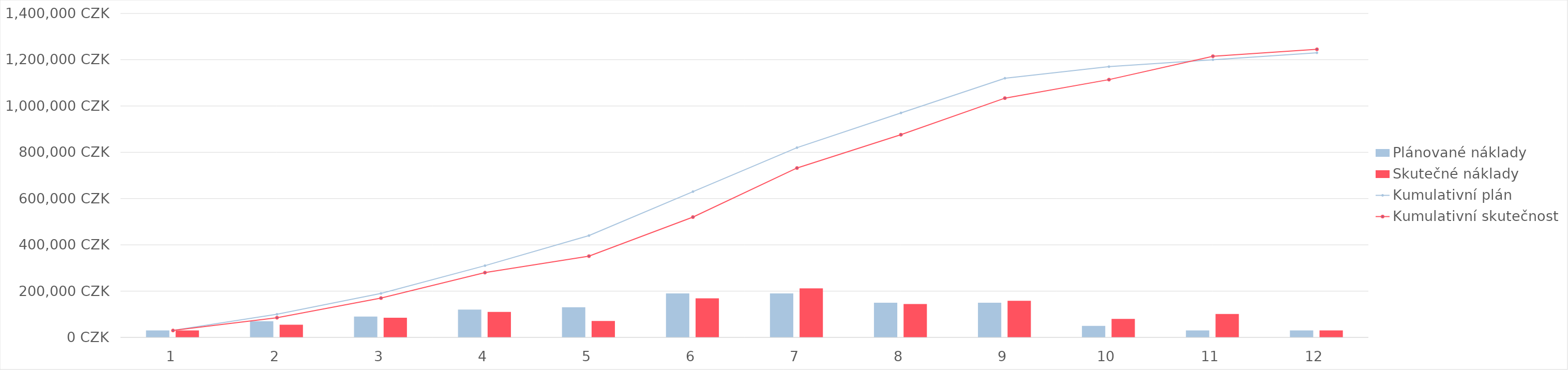
| Category | Plánované náklady | Skutečné náklady |
|---|---|---|
| 0 | 30000 | 30000 |
| 1 | 70000 | 55000 |
| 2 | 90000 | 85000 |
| 3 | 120000 | 110000 |
| 4 | 130000 | 71000 |
| 5 | 190000 | 169000 |
| 6 | 190000 | 212000 |
| 7 | 150000 | 144000 |
| 8 | 150000 | 158000 |
| 9 | 50000 | 80000 |
| 10 | 30000 | 101000 |
| 11 | 30000 | 30000 |